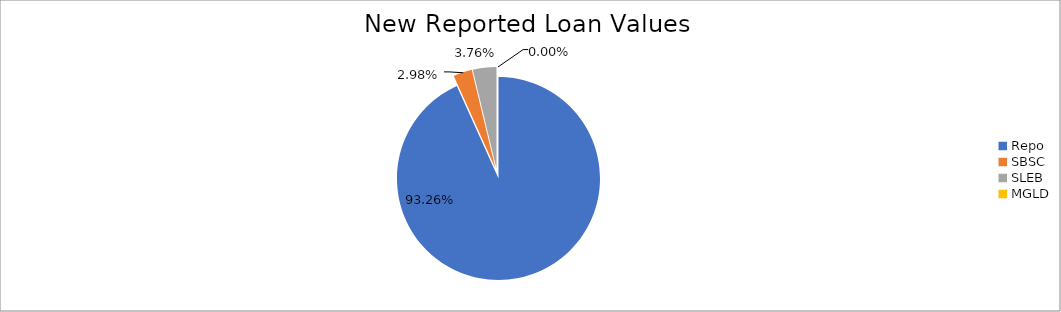
| Category | Series 0 |
|---|---|
| Repo | 9212145.259 |
| SBSC | 294123.304 |
| SLEB | 371217.777 |
| MGLD | 27.955 |